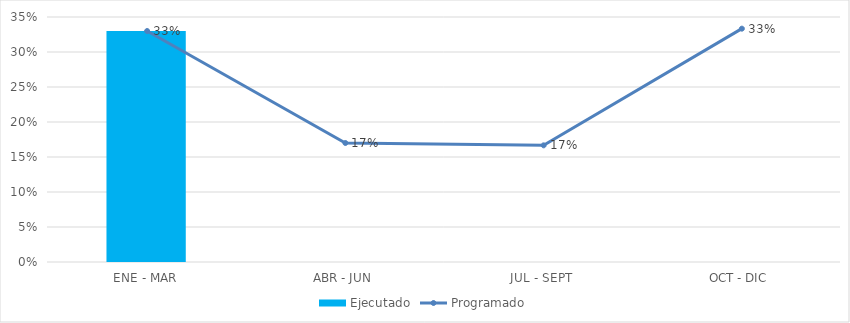
| Category | Ejecutado |
|---|---|
| ENE - MAR | 0.33 |
| ABR - JUN | 0 |
| JUL - SEPT | 0 |
| OCT - DIC | 0 |